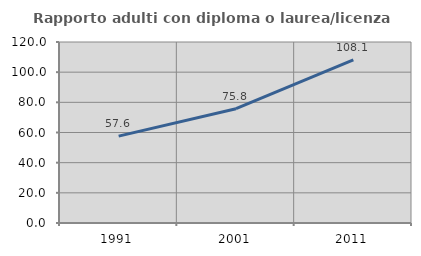
| Category | Rapporto adulti con diploma o laurea/licenza media  |
|---|---|
| 1991.0 | 57.618 |
| 2001.0 | 75.759 |
| 2011.0 | 108.075 |